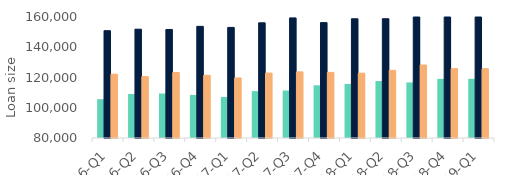
| Category | First-time
buyers | Homemovers | Homowner remortgaging |
|---|---|---|---|
| 16-Q1 | 105677.326 | 150940.926 | 122183.051 |
| 16-Q2 | 109092.477 | 151940.615 | 120619.362 |
| 16-Q3 | 109404.381 | 151751.367 | 123299.102 |
| 16-Q4 | 108462.538 | 153819.799 | 121469.882 |
| 17-Q1 | 107143.478 | 153126.34 | 119697.041 |
| 17-Q2 | 110993.912 | 156159.89 | 122939.294 |
| 17-Q3 | 111392.176 | 159393.224 | 123718.651 |
| 17-Q4 | 114834.059 | 156298.601 | 123377.649 |
| 18-Q1 | 115756.887 | 158832.571 | 122865.355 |
| 18-Q2 | 117657.034 | 158852.144 | 124722.806 |
| 18-Q3 | 116729.828 | 160673.99 | 128274.473 |
| 18-Q4 | 119071.898 | 161148.419 | 125848.867 |
| 19-Q1 | 119123.26 | 162612.565 | 125771.726 |